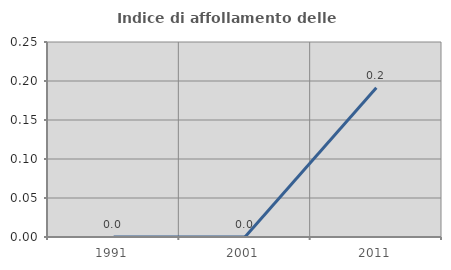
| Category | Indice di affollamento delle abitazioni  |
|---|---|
| 1991.0 | 0 |
| 2001.0 | 0 |
| 2011.0 | 0.191 |